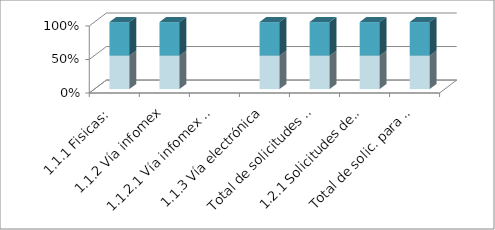
| Category | Series 3 | Series 4 | Series 5 | Series 0 | Series 1 | Series 2 |
|---|---|---|---|---|---|---|
| 1.1.1 Fisicas: |  |  | 2 |  |  | 2 |
| 1.1.2 Vía infomex |  |  | 12 |  |  | 12 |
| 1.1.2.1 Vía infomex - PNT |  |  | 0 |  |  | 0 |
| 1.1.3 Vía electrónica |  |  | 9 |  |  | 9 |
| Total de solicitudes recibidas: |  |  | 23 |  |  | 23 |
| 1.2.1 Solicitudes derivadas por incom |  |  | 1 |  |  | 1 |
| Total de solic. para resolución: |  |  | 22 |  |  | 22 |